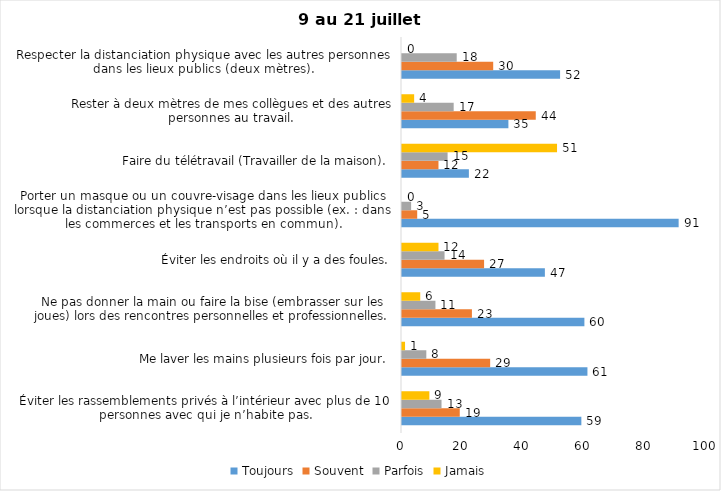
| Category | Toujours | Souvent | Parfois | Jamais |
|---|---|---|---|---|
| Éviter les rassemblements privés à l’intérieur avec plus de 10 personnes avec qui je n’habite pas. | 59 | 19 | 13 | 9 |
| Me laver les mains plusieurs fois par jour. | 61 | 29 | 8 | 1 |
| Ne pas donner la main ou faire la bise (embrasser sur les joues) lors des rencontres personnelles et professionnelles. | 60 | 23 | 11 | 6 |
| Éviter les endroits où il y a des foules. | 47 | 27 | 14 | 12 |
| Porter un masque ou un couvre-visage dans les lieux publics lorsque la distanciation physique n’est pas possible (ex. : dans les commerces et les transports en commun). | 91 | 5 | 3 | 0 |
| Faire du télétravail (Travailler de la maison). | 22 | 12 | 15 | 51 |
| Rester à deux mètres de mes collègues et des autres personnes au travail. | 35 | 44 | 17 | 4 |
| Respecter la distanciation physique avec les autres personnes dans les lieux publics (deux mètres). | 52 | 30 | 18 | 0 |